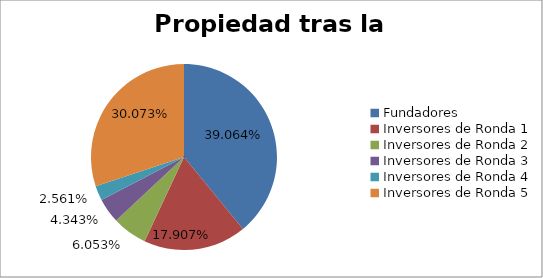
| Category | Series 0 |
|---|---|
| Fundadores | 0.391 |
| Inversores de Ronda 1 | 0.179 |
| Inversores de Ronda 2 | 0.061 |
| Inversores de Ronda 3 | 0.043 |
| Inversores de Ronda 4 | 0.026 |
| Inversores de Ronda 5 | 0.301 |